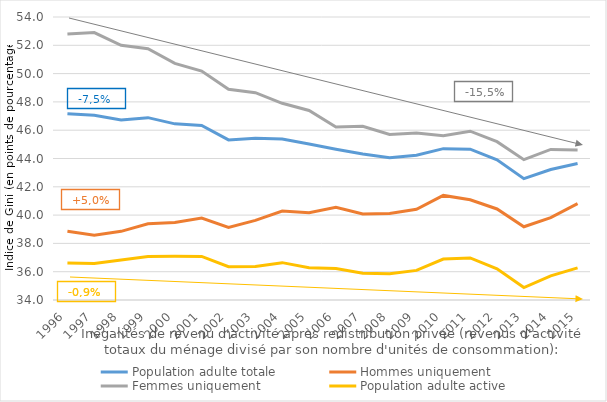
| Category | Population adulte totale | Hommes uniquement | Femmes uniquement | Population adulte active |
|---|---|---|---|---|
| 1996.0 | 47.171 | 38.855 | 52.806 | 36.614 |
| 1997.0 | 47.049 | 38.57 | 52.903 | 36.587 |
| 1998.0 | 46.722 | 38.853 | 52.005 | 36.827 |
| 1999.0 | 46.887 | 39.391 | 51.752 | 37.071 |
| 2000.0 | 46.449 | 39.477 | 50.72 | 37.088 |
| 2001.0 | 46.334 | 39.785 | 50.177 | 37.081 |
| 2002.0 | 45.315 | 39.126 | 48.896 | 36.35 |
| 2003.0 | 45.436 | 39.629 | 48.651 | 36.362 |
| 2004.0 | 45.373 | 40.293 | 47.901 | 36.64 |
| 2005.0 | 45.019 | 40.167 | 47.395 | 36.276 |
| 2006.0 | 44.658 | 40.555 | 46.229 | 36.219 |
| 2007.0 | 44.312 | 40.077 | 46.281 | 35.898 |
| 2008.0 | 44.049 | 40.109 | 45.695 | 35.855 |
| 2009.0 | 44.233 | 40.409 | 45.799 | 36.092 |
| 2010.0 | 44.695 | 41.39 | 45.604 | 36.893 |
| 2011.0 | 44.66 | 41.082 | 45.929 | 36.973 |
| 2012.0 | 43.901 | 40.434 | 45.19 | 36.206 |
| 2013.0 | 42.572 | 39.176 | 43.918 | 34.881 |
| 2014.0 | 43.221 | 39.823 | 44.643 | 35.711 |
| 2015.0 | 43.644 | 40.806 | 44.604 | 36.27 |